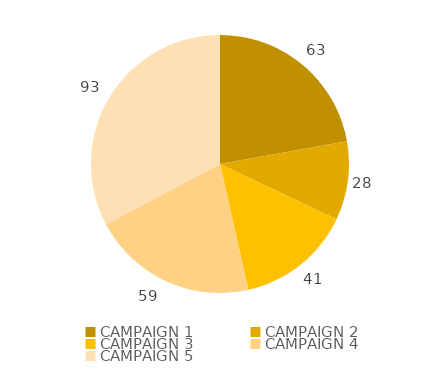
| Category | Series 0 |
|---|---|
| CAMPAIGN 1 | 63 |
| CAMPAIGN 2 | 28 |
| CAMPAIGN 3 | 41 |
| CAMPAIGN 4 | 59 |
| CAMPAIGN 5 | 93 |